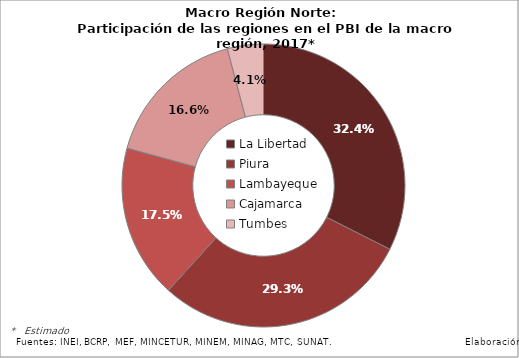
| Category | Series 0 |
|---|---|
| La Libertad | 0.324 |
| Piura | 0.293 |
| Lambayeque | 0.175 |
| Cajamarca | 0.166 |
| Tumbes | 0.041 |